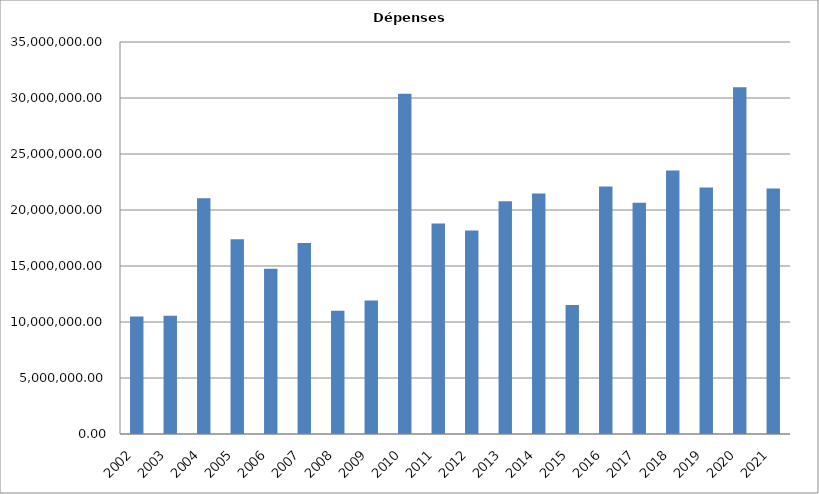
| Category | Series 0 |
|---|---|
| 2002.0 | 10488358.55 |
| 2003.0 | 10548880.49 |
| 2004.0 | 21053617.34 |
| 2005.0 | 17385787.78 |
| 2006.0 | 14760446.2 |
| 2007.0 | 17055788.58 |
| 2008.0 | 11007005.54 |
| 2009.0 | 11921404.42 |
| 2010.0 | 30374345.76 |
| 2011.0 | 18804875.5 |
| 2012.0 | 18177706.09 |
| 2013.0 | 20780282.72 |
| 2014.0 | 21463384.93 |
| 2015.0 | 11525408.21 |
| 2016.0 | 22107375.66 |
| 2017.0 | 20652690.21 |
| 2018.0 | 23521350.94 |
| 2019.0 | 22012531.23 |
| 2020.0 | 30957999 |
| 2021.0 | 21919797.44 |